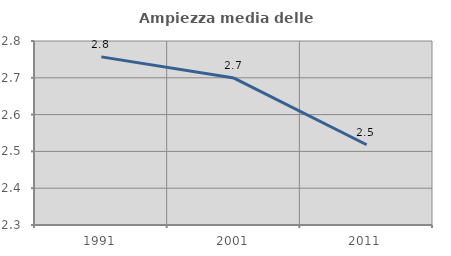
| Category | Ampiezza media delle famiglie |
|---|---|
| 1991.0 | 2.757 |
| 2001.0 | 2.699 |
| 2011.0 | 2.518 |